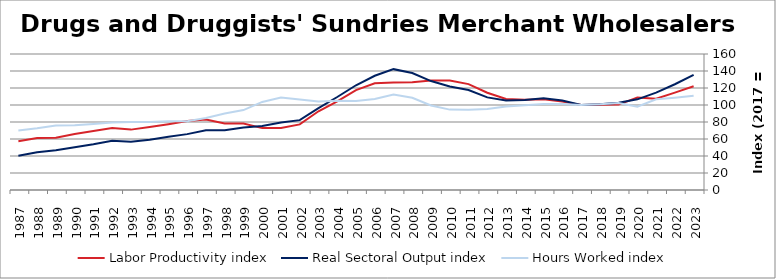
| Category | Labor Productivity index | Real Sectoral Output index | Hours Worked index |
|---|---|---|---|
| 2023.0 | 121.985 | 135.375 | 110.976 |
| 2022.0 | 114.525 | 124.411 | 108.633 |
| 2021.0 | 107.324 | 114.532 | 106.716 |
| 2020.0 | 108.797 | 106.638 | 98.015 |
| 2019.0 | 100.465 | 102.749 | 102.274 |
| 2018.0 | 100.15 | 100.892 | 100.741 |
| 2017.0 | 100 | 100 | 100 |
| 2016.0 | 103.979 | 105.235 | 101.208 |
| 2015.0 | 106.764 | 107.947 | 101.108 |
| 2014.0 | 106.134 | 105.853 | 99.735 |
| 2013.0 | 107.157 | 105.254 | 98.224 |
| 2012.0 | 114.431 | 108.944 | 95.205 |
| 2011.0 | 124.571 | 117.676 | 94.465 |
| 2010.0 | 128.87 | 121.863 | 94.562 |
| 2009.0 | 128.873 | 128.134 | 99.427 |
| 2008.0 | 126.845 | 137.591 | 108.472 |
| 2007.0 | 126.478 | 142.175 | 112.411 |
| 2006.0 | 125.553 | 134.378 | 107.029 |
| 2005.0 | 117.597 | 123.222 | 104.784 |
| 2004.0 | 104.322 | 109.415 | 104.882 |
| 2003.0 | 92.584 | 96.293 | 104.006 |
| 2002.0 | 77.142 | 82.179 | 106.529 |
| 2001.0 | 72.94 | 79.455 | 108.933 |
| 2000.0 | 72.798 | 75.421 | 103.603 |
| 1999.0 | 78.19 | 73.505 | 94.008 |
| 1998.0 | 78.254 | 70.367 | 89.921 |
| 1997.0 | 82.926 | 70.264 | 84.731 |
| 1996.0 | 81.185 | 65.74 | 80.975 |
| 1995.0 | 77.429 | 62.677 | 80.948 |
| 1994.0 | 74.022 | 59.121 | 79.869 |
| 1993.0 | 71.038 | 56.833 | 80.004 |
| 1992.0 | 72.913 | 57.947 | 79.474 |
| 1991.0 | 69.283 | 53.857 | 77.735 |
| 1990.0 | 65.949 | 50.286 | 76.25 |
| 1989.0 | 61.425 | 46.677 | 75.99 |
| 1988.0 | 61.038 | 44.326 | 72.62 |
| 1987.0 | 57.334 | 40.179 | 70.08 |